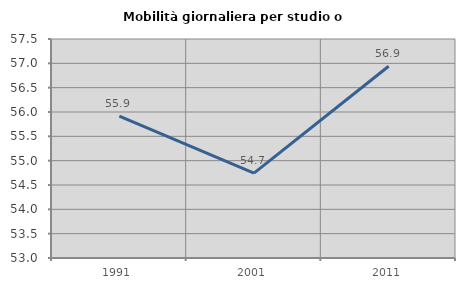
| Category | Mobilità giornaliera per studio o lavoro |
|---|---|
| 1991.0 | 55.916 |
| 2001.0 | 54.744 |
| 2011.0 | 56.94 |